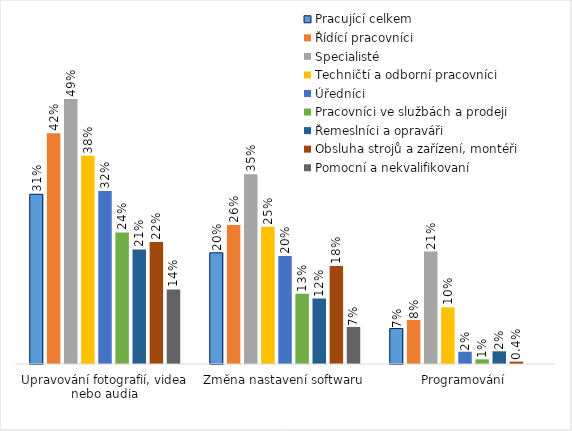
| Category | Pracující celkem | Řídící pracovníci | Specialisté | Techničtí a odborní pracovníci | Úředníci | Pracovníci ve službách a prodeji | Řemeslníci a opraváři | Obsluha strojů a zařízení, montéři | Pomocní a nekvalifikovaní |
|---|---|---|---|---|---|---|---|---|---|
| Upravování fotografií, videa nebo audia | 0.311 | 0.423 | 0.486 | 0.382 | 0.318 | 0.241 | 0.21 | 0.224 | 0.137 |
| Změna nastavení softwaru | 0.204 | 0.255 | 0.348 | 0.252 | 0.198 | 0.129 | 0.12 | 0.18 | 0.068 |
| Programování | 0.065 | 0.081 | 0.206 | 0.104 | 0.023 | 0.009 | 0.023 | 0.004 | 0 |